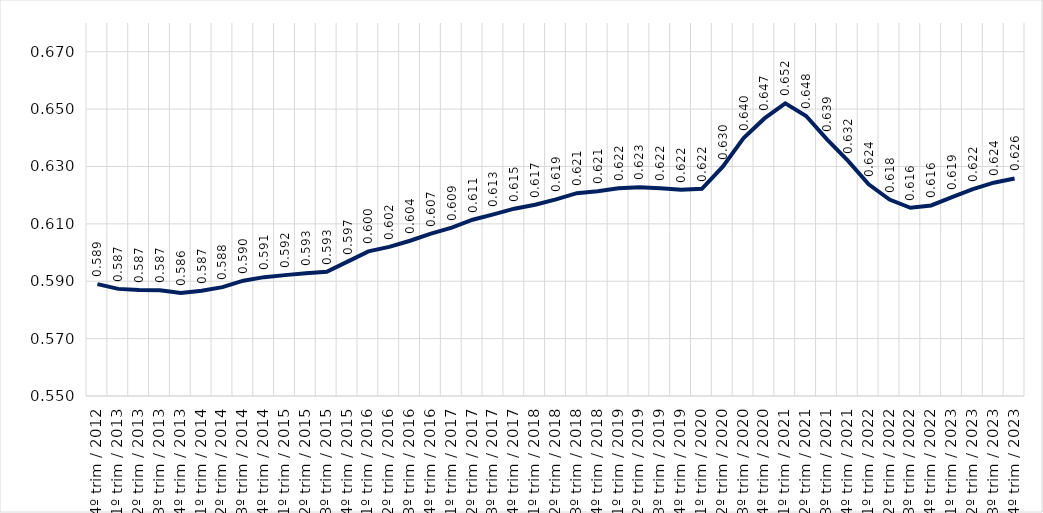
| Category | Conjunto RMs |
|---|---|
| 4º trim / 2012 | 0.589 |
| 1º trim / 2013 | 0.587 |
| 2º trim / 2013 | 0.587 |
| 3º trim / 2013 | 0.587 |
| 4º trim / 2013 | 0.586 |
| 1º trim / 2014 | 0.587 |
| 2º trim / 2014 | 0.588 |
| 3º trim / 2014 | 0.59 |
| 4º trim / 2014 | 0.591 |
| 1º trim / 2015 | 0.592 |
| 2º trim / 2015 | 0.593 |
| 3º trim / 2015 | 0.593 |
| 4º trim / 2015 | 0.597 |
| 1º trim / 2016 | 0.6 |
| 2º trim / 2016 | 0.602 |
| 3º trim / 2016 | 0.604 |
| 4º trim / 2016 | 0.607 |
| 1º trim / 2017 | 0.609 |
| 2º trim / 2017 | 0.611 |
| 3º trim / 2017 | 0.613 |
| 4º trim / 2017 | 0.615 |
| 1º trim / 2018 | 0.617 |
| 2º trim / 2018 | 0.619 |
| 3º trim / 2018 | 0.621 |
| 4º trim / 2018 | 0.621 |
| 1º trim / 2019 | 0.622 |
| 2º trim / 2019 | 0.623 |
| 3º trim / 2019 | 0.622 |
| 4º trim / 2019 | 0.622 |
| 1º trim / 2020 | 0.622 |
| 2º trim / 2020 | 0.63 |
| 3º trim / 2020 | 0.64 |
| 4º trim / 2020 | 0.647 |
| 1º trim / 2021 | 0.652 |
| 2º trim / 2021 | 0.648 |
| 3º trim / 2021 | 0.639 |
| 4º trim / 2021 | 0.632 |
| 1º trim / 2022 | 0.624 |
| 2º trim / 2022 | 0.618 |
| 3º trim / 2022 | 0.616 |
| 4º trim / 2022 | 0.616 |
| 1º trim / 2023 | 0.619 |
| 2º trim / 2023 | 0.622 |
| 3º trim / 2023 | 0.624 |
| 4º trim / 2023 | 0.626 |